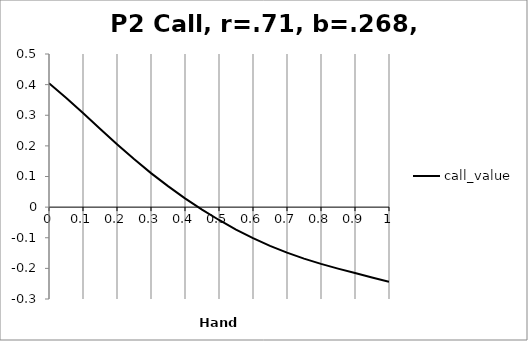
| Category | call_value |
|---|---|
| 0.0 | 0.405 |
| 0.05 | 0.357 |
| 0.1 | 0.307 |
| 0.15 | 0.256 |
| 0.2 | 0.205 |
| 0.25 | 0.157 |
| 0.3 | 0.111 |
| 0.35 | 0.069 |
| 0.4 | 0.029 |
| 0.45 | -0.008 |
| 0.5 | -0.042 |
| 0.55 | -0.073 |
| 0.6 | -0.101 |
| 0.65 | -0.127 |
| 0.7 | -0.149 |
| 0.75 | -0.168 |
| 0.8 | -0.185 |
| 0.85 | -0.201 |
| 0.9 | -0.215 |
| 0.95 | -0.23 |
| 1.0 | -0.244 |